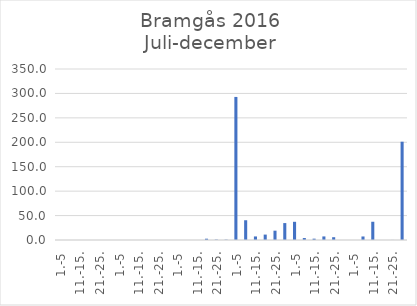
| Category | Series 0 |
|---|---|
| 1.-5 | 0 |
| 6.-10. | 0 |
| 11.-15. | 0 |
| 16.-20. | 0 |
| 21.-25. | 0 |
| 26.-31. | 0 |
| 1.-5 | 0 |
| 6.-10. | 0 |
| 11.-15. | 0 |
| 16.-20. | 0 |
| 21.-25. | 0 |
| 26.-31. | 0 |
| 1.-5 | 0 |
| 6.-10. | 0 |
| 11.-15. | 0 |
| 16.-20. | 2.661 |
| 21.-25. | 0.832 |
| 26.-30. | 0.688 |
| 1.-5 | 292.822 |
| 6.-10. | 40.431 |
| 11.-15. | 7.27 |
| 16.-20. | 11.077 |
| 21.-25. | 19.095 |
| 26.-31. | 34.638 |
| 1.-5 | 37.257 |
| 6.-10. | 4.026 |
| 11.-15. | 2.726 |
| 16.-20. | 7.317 |
| 21.-25. | 5.707 |
| 26.-30. | 0 |
| 1.-5 | 0 |
| 6.-10. | 7.222 |
| 11.-15. | 37.34 |
| 16.-20. | 0 |
| 21.-25. | 0.11 |
| 26.-31. | 201.166 |